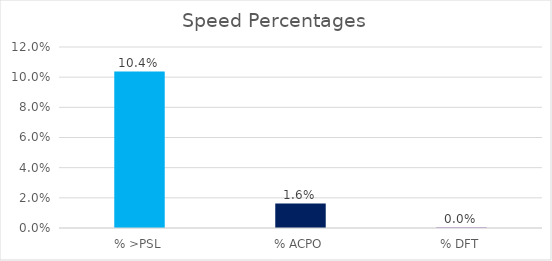
| Category | Series 0 |
|---|---|
| % >PSL | 0.104 |
| % ACPO | 0.016 |
| % DFT | 0 |